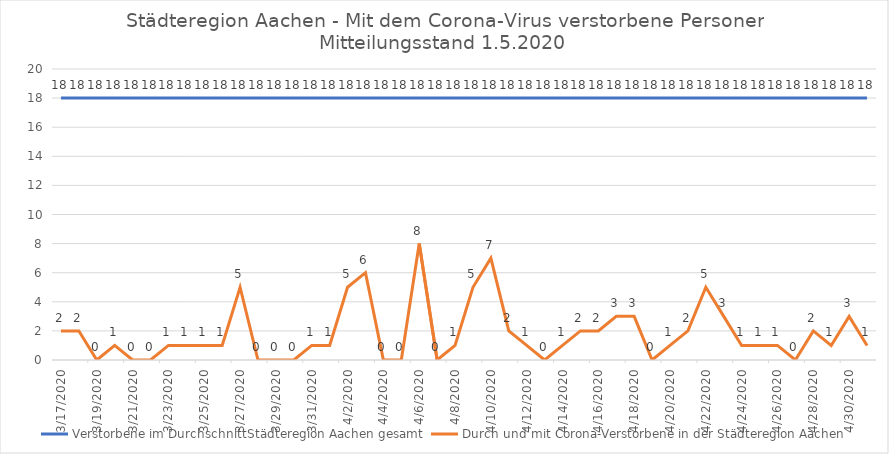
| Category | Verstorbene im DurchschnittStädteregion Aachen gesamt | Durch und mit Corona-Verstorbene in der Städteregion Aachen |
|---|---|---|
| 3/17/20 | 18 | 2 |
| 3/18/20 | 18 | 2 |
| 3/19/20 | 18 | 0 |
| 3/20/20 | 18 | 1 |
| 3/21/20 | 18 | 0 |
| 3/22/20 | 18 | 0 |
| 3/23/20 | 18 | 1 |
| 3/24/20 | 18 | 1 |
| 3/25/20 | 18 | 1 |
| 3/26/20 | 18 | 1 |
| 3/27/20 | 18 | 5 |
| 3/28/20 | 18 | 0 |
| 3/29/20 | 18 | 0 |
| 3/30/20 | 18 | 0 |
| 3/31/20 | 18 | 1 |
| 4/1/20 | 18 | 1 |
| 4/2/20 | 18 | 5 |
| 4/3/20 | 18 | 6 |
| 4/4/20 | 18 | 0 |
| 4/5/20 | 18 | 0 |
| 4/6/20 | 18 | 8 |
| 4/7/20 | 18 | 0 |
| 4/8/20 | 18 | 1 |
| 4/9/20 | 18 | 5 |
| 4/10/20 | 18 | 7 |
| 4/11/20 | 18 | 2 |
| 4/12/20 | 18 | 1 |
| 4/13/20 | 18 | 0 |
| 4/14/20 | 18 | 1 |
| 4/15/20 | 18 | 2 |
| 4/16/20 | 18 | 2 |
| 4/17/20 | 18 | 3 |
| 4/18/20 | 18 | 3 |
| 4/19/20 | 18 | 0 |
| 4/20/20 | 18 | 1 |
| 4/21/20 | 18 | 2 |
| 4/22/20 | 18 | 5 |
| 4/23/20 | 18 | 3 |
| 4/24/20 | 18 | 1 |
| 4/25/20 | 18 | 1 |
| 4/26/20 | 18 | 1 |
| 4/27/20 | 18 | 0 |
| 4/28/20 | 18 | 2 |
| 4/29/20 | 18 | 1 |
| 4/30/20 | 18 | 3 |
| 5/1/20 | 18 | 1 |